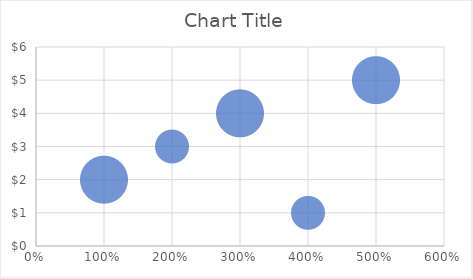
| Category | Series 0 |
|---|---|
| 1.0 | 2 |
| 2.0 | 3 |
| 3.0 | 4 |
| 4.0 | 1 |
| 5.0 | 5 |